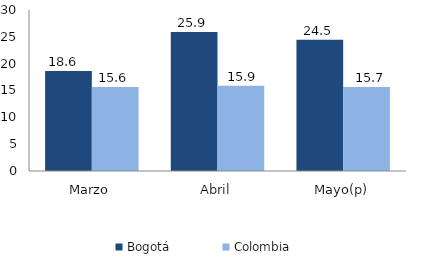
| Category | Bogotá | Colombia |
|---|---|---|
| Marzo | 18.632 | 15.631 |
| Abril | 25.897 | 15.883 |
| Mayo(p) | 24.473 | 15.656 |